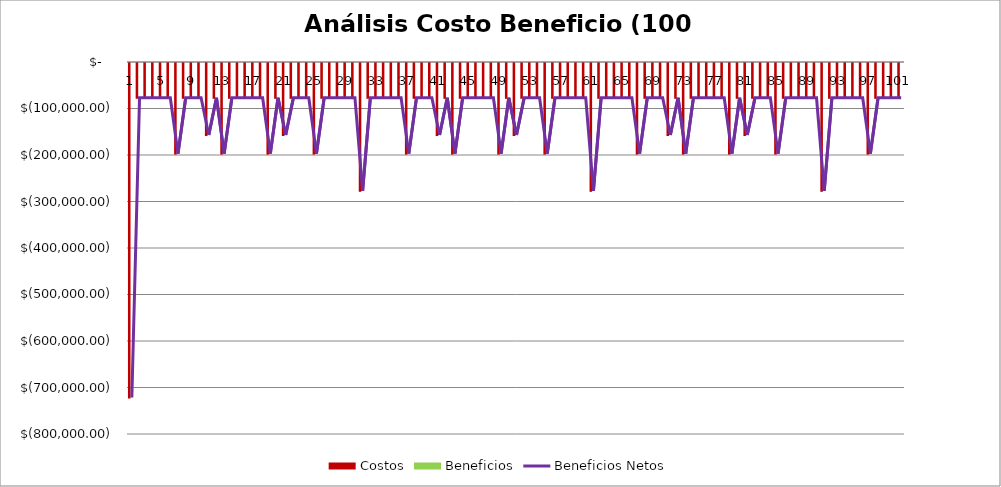
| Category |  Costos  |  Beneficios  |
|---|---|---|
| 0 | -721405.246 | 0 |
| 1 | -76964.185 | 0 |
| 2 | -76964.185 | 0 |
| 3 | -76964.185 | 0 |
| 4 | -76964.185 | 0 |
| 5 | -76964.185 | 0 |
| 6 | -196964.185 | 0 |
| 7 | -76964.185 | 0 |
| 8 | -76964.185 | 0 |
| 9 | -76964.185 | 0 |
| 10 | -156964.185 | 0 |
| 11 | -76964.185 | 0 |
| 12 | -196964.185 | 0 |
| 13 | -76964.185 | 0 |
| 14 | -76964.185 | 0 |
| 15 | -76964.185 | 0 |
| 16 | -76964.185 | 0 |
| 17 | -76964.185 | 0 |
| 18 | -196964.185 | 0 |
| 19 | -76964.185 | 0 |
| 20 | -156964.185 | 0 |
| 21 | -76964.185 | 0 |
| 22 | -76964.185 | 0 |
| 23 | -76964.185 | 0 |
| 24 | -196964.185 | 0 |
| 25 | -76964.185 | 0 |
| 26 | -76964.185 | 0 |
| 27 | -76964.185 | 0 |
| 28 | -76964.185 | 0 |
| 29 | -76964.185 | 0 |
| 30 | -276964.185 | 0 |
| 31 | -76964.185 | 0 |
| 32 | -76964.185 | 0 |
| 33 | -76964.185 | 0 |
| 34 | -76964.185 | 0 |
| 35 | -76964.185 | 0 |
| 36 | -196964.185 | 0 |
| 37 | -76964.185 | 0 |
| 38 | -76964.185 | 0 |
| 39 | -76964.185 | 0 |
| 40 | -156964.185 | 0 |
| 41 | -76964.185 | 0 |
| 42 | -196964.185 | 0 |
| 43 | -76964.185 | 0 |
| 44 | -76964.185 | 0 |
| 45 | -76964.185 | 0 |
| 46 | -76964.185 | 0 |
| 47 | -76964.185 | 0 |
| 48 | -196964.185 | 0 |
| 49 | -76964.185 | 0 |
| 50 | -156964.185 | 0 |
| 51 | -76964.185 | 0 |
| 52 | -76964.185 | 0 |
| 53 | -76964.185 | 0 |
| 54 | -196964.185 | 0 |
| 55 | -76964.185 | 0 |
| 56 | -76964.185 | 0 |
| 57 | -76964.185 | 0 |
| 58 | -76964.185 | 0 |
| 59 | -76964.185 | 0 |
| 60 | -276964.185 | 0 |
| 61 | -76964.185 | 0 |
| 62 | -76964.185 | 0 |
| 63 | -76964.185 | 0 |
| 64 | -76964.185 | 0 |
| 65 | -76964.185 | 0 |
| 66 | -196964.185 | 0 |
| 67 | -76964.185 | 0 |
| 68 | -76964.185 | 0 |
| 69 | -76964.185 | 0 |
| 70 | -156964.185 | 0 |
| 71 | -76964.185 | 0 |
| 72 | -196964.185 | 0 |
| 73 | -76964.185 | 0 |
| 74 | -76964.185 | 0 |
| 75 | -76964.185 | 0 |
| 76 | -76964.185 | 0 |
| 77 | -76964.185 | 0 |
| 78 | -196964.185 | 0 |
| 79 | -76964.185 | 0 |
| 80 | -156964.185 | 0 |
| 81 | -76964.185 | 0 |
| 82 | -76964.185 | 0 |
| 83 | -76964.185 | 0 |
| 84 | -196964.185 | 0 |
| 85 | -76964.185 | 0 |
| 86 | -76964.185 | 0 |
| 87 | -76964.185 | 0 |
| 88 | -76964.185 | 0 |
| 89 | -76964.185 | 0 |
| 90 | -276964.185 | 0 |
| 91 | -76964.185 | 0 |
| 92 | -76964.185 | 0 |
| 93 | -76964.185 | 0 |
| 94 | -76964.185 | 0 |
| 95 | -76964.185 | 0 |
| 96 | -196964.185 | 0 |
| 97 | -76964.185 | 0 |
| 98 | -76964.185 | 0 |
| 99 | -76964.185 | 0 |
| 100 | -76964.185 | 0 |